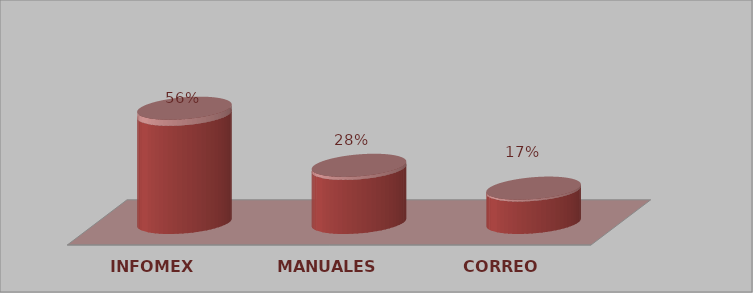
| Category | Series 0 | Series 1 |
|---|---|---|
| INFOMEX | 10 | 0.556 |
| MANUALES | 5 | 0.278 |
| CORREO | 3 | 0.167 |